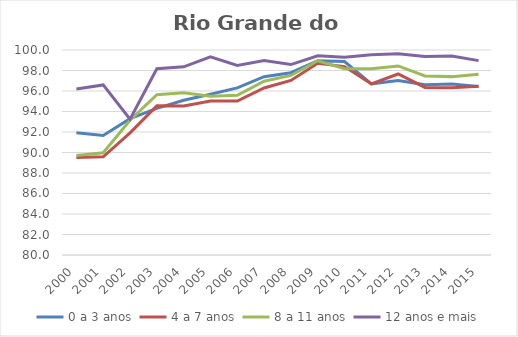
| Category | 0 a 3 anos | 4 a 7 anos | 8 a 11 anos | 12 anos e mais |
|---|---|---|---|---|
| 2000.0 | 91.92 | 89.507 | 89.706 | 96.192 |
| 2001.0 | 91.667 | 89.578 | 89.979 | 96.593 |
| 2002.0 | 93.299 | 91.913 | 93.147 | 93.25 |
| 2003.0 | 94.309 | 94.551 | 95.645 | 98.176 |
| 2004.0 | 95.095 | 94.534 | 95.817 | 98.362 |
| 2005.0 | 95.679 | 95.023 | 95.492 | 99.328 |
| 2006.0 | 96.306 | 95.027 | 95.577 | 98.497 |
| 2007.0 | 97.398 | 96.292 | 96.95 | 98.975 |
| 2008.0 | 97.784 | 97.033 | 97.517 | 98.579 |
| 2009.0 | 98.953 | 98.71 | 98.946 | 99.428 |
| 2010.0 | 98.877 | 98.382 | 98.183 | 99.297 |
| 2011.0 | 96.698 | 96.695 | 98.182 | 99.548 |
| 2012.0 | 97.019 | 97.659 | 98.447 | 99.632 |
| 2013.0 | 96.601 | 96.346 | 97.467 | 99.37 |
| 2014.0 | 96.694 | 96.305 | 97.403 | 99.424 |
| 2015.0 | 96.438 | 96.457 | 97.628 | 98.964 |